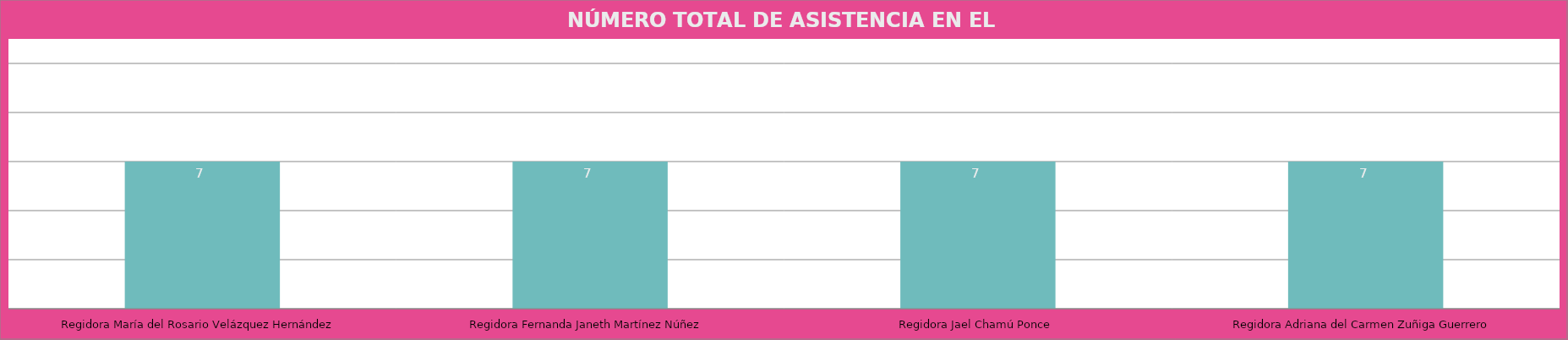
| Category | Regidora María del Rosario Velázquez Hernández |
|---|---|
| Regidora María del Rosario Velázquez Hernández | 7 |
| Regidora Fernanda Janeth Martínez Núñez | 7 |
| Regidora Jael Chamú Ponce | 7 |
| Regidora Adriana del Carmen Zuñiga Guerrero | 7 |